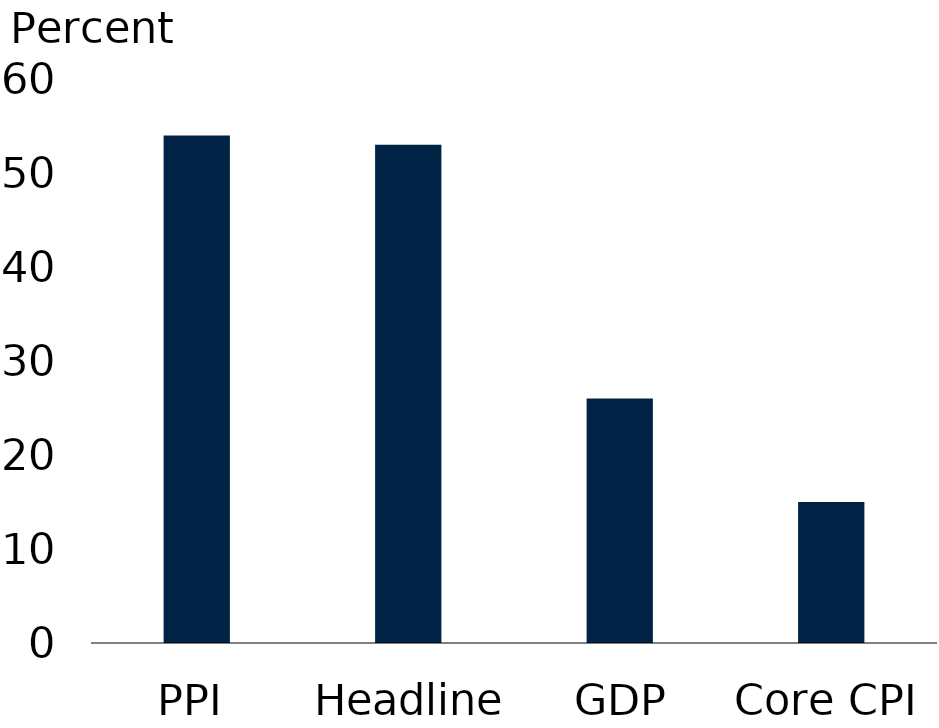
| Category | Series 0 |
|---|---|
| PPI | 54 |
| Headline CPI | 53 |
| GDP deflator | 26 |
| Core CPI | 15 |